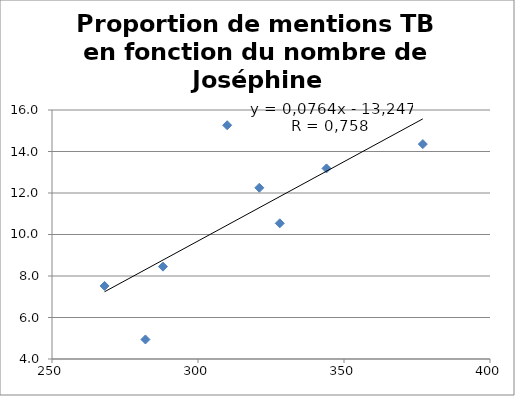
| Category | Proportion de mentions TB en fonction du nombre de Joséphine |
|---|---|
| 282.0 | 4.941 |
| 268.0 | 7.521 |
| 288.0 | 8.451 |
| 328.0 | 10.539 |
| 321.0 | 12.251 |
| 344.0 | 13.185 |
| 377.0 | 14.356 |
| 310.0 | 15.266 |